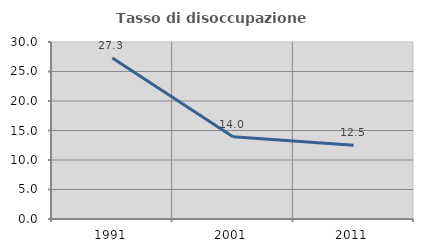
| Category | Tasso di disoccupazione giovanile  |
|---|---|
| 1991.0 | 27.273 |
| 2001.0 | 13.953 |
| 2011.0 | 12.5 |